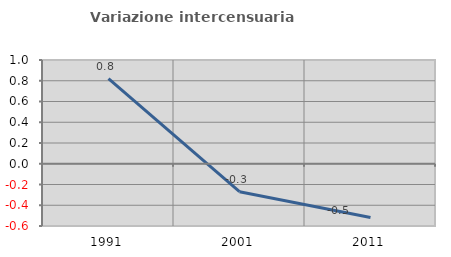
| Category | Variazione intercensuaria annua |
|---|---|
| 1991.0 | 0.821 |
| 2001.0 | -0.269 |
| 2011.0 | -0.519 |